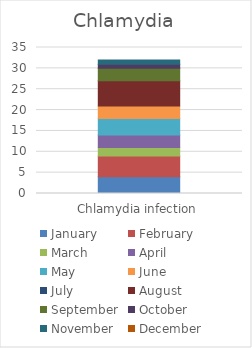
| Category | January | February | March | April | May | June | July | August | September | October | November | December |
|---|---|---|---|---|---|---|---|---|---|---|---|---|
| Chlamydia infection | 4 | 5 | 2 | 3 | 4 | 3 | 0 | 6 | 3 | 1 | 1 | 0 |